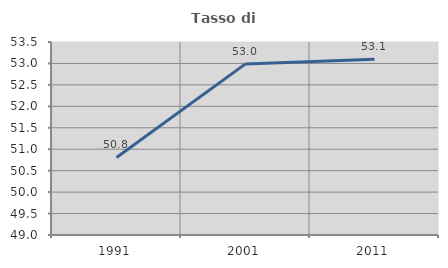
| Category | Tasso di occupazione   |
|---|---|
| 1991.0 | 50.809 |
| 2001.0 | 52.99 |
| 2011.0 | 53.099 |